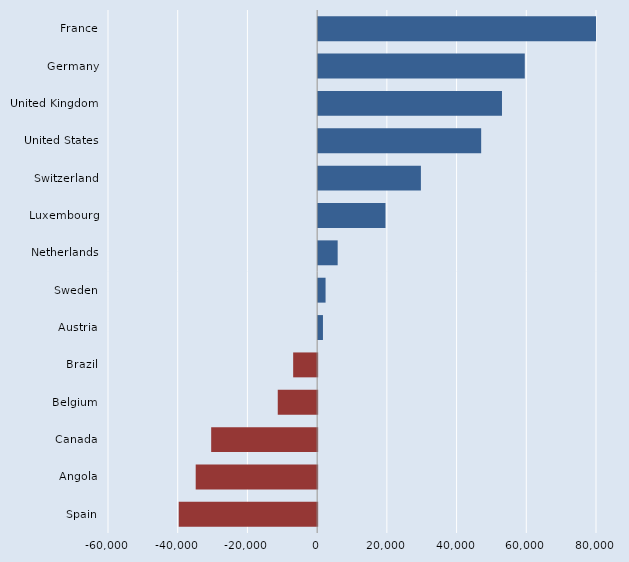
| Category | Series 0 |
|---|---|
| France | 150940 |
| Germany | 59280 |
| United Kingdom | 52740 |
| United States | 46770 |
| Switzerland | 29480 |
| Luxembourg | 19320 |
| Netherlands | 5600 |
| Sweden | 2130 |
| Austria | 1380 |
| Brazil | -6880 |
| Belgium | -11300 |
| Canada | -30400 |
| Angola | -34840 |
| Spain | -39710 |